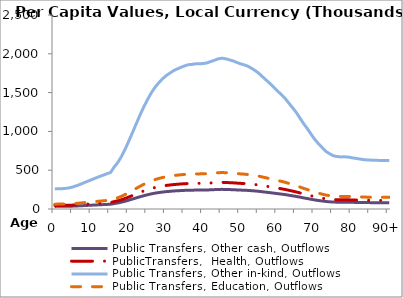
| Category | Public Transfers, Other cash, Outflows | PublicTransfers,  Health, Outflows | Public Transfers, Other in-kind, Outflows | Public Transfers, Education, Outflows |
|---|---|---|---|---|
| 0 | 33729.785 | 45748.895 | 259036.511 | 62617.094 |
|  | 33926.138 | 46015.216 | 260544.457 | 62981.611 |
| 2 | 34122.492 | 46281.537 | 262052.403 | 63346.128 |
| 3 | 34643.48 | 46988.171 | 266053.465 | 64313.308 |
| 4 | 35672.581 | 48383.978 | 273956.711 | 66223.765 |
| 5 | 37299.635 | 50590.809 | 286452.091 | 69244.283 |
| 6 | 39365.383 | 53392.654 | 302316.526 | 73079.205 |
| 7 | 41814.51 | 56714.492 | 321125.224 | 77625.846 |
| 8 | 44399.695 | 60220.87 | 340978.819 | 82425.071 |
| 9 | 46978.956 | 63719.212 | 360786.912 | 87213.296 |
| 10 | 49529.367 | 67178.425 | 380373.445 | 91947.964 |
| 11 | 52023.029 | 70560.666 | 399524.16 | 96577.281 |
| 12 | 54402.84 | 73788.487 | 417800.525 | 100995.24 |
| 13 | 56761.513 | 76987.639 | 435914.559 | 105373.96 |
| 14 | 59074.511 | 80124.839 | 453677.817 | 109667.886 |
| 15 | 61389.263 | 83264.419 | 471454.551 | 113965.069 |
| 16 | 70571.418 | 95718.499 | 541971.258 | 131011.127 |
| 17 | 78572.335 | 106570.425 | 603416.351 | 145864.296 |
| 18 | 88861.227 | 120525.611 | 682432.522 | 164964.936 |
| 19 | 101332.769 | 137441.203 | 778210.925 | 188117.522 |
| 20 | 115301.229 | 156387.116 | 885485.281 | 214049.034 |
| 21 | 129681.397 | 175891.445 | 995921.463 | 240744.857 |
| 22 | 144316.051 | 195740.942 | 1108312.036 | 267913.116 |
| 23 | 158678.481 | 215221.211 | 1218611.985 | 294576.007 |
| 24 | 172071.325 | 233386.397 | 1321465.76 | 319438.929 |
| 25 | 184260.198 | 249918.594 | 1415073.325 | 342066.757 |
| 26 | 195201.582 | 264758.778 | 1499100.482 | 362378.706 |
| 27 | 204449.953 | 277302.671 | 1570125.72 | 379547.691 |
| 28 | 212023.346 | 287574.73 | 1628287.525 | 393607.189 |
| 29 | 218528.347 | 296397.692 | 1678244.344 | 405683.289 |
| 30 | 223960.775 | 303765.885 | 1719964.066 | 415768.229 |
| 31 | 228142.671 | 309437.937 | 1752080.002 | 423531.639 |
| 32 | 232284.804 | 315056.059 | 1783890.578 | 431221.234 |
| 33 | 235172.879 | 318973.256 | 1806070.283 | 436582.751 |
| 34 | 237910.906 | 322686.939 | 1827097.664 | 441665.716 |
| 35 | 240282.455 | 325903.554 | 1845310.579 | 446068.338 |
| 36 | 242181.347 | 328479.088 | 1859893.608 | 449593.505 |
| 37 | 242687.852 | 329166.078 | 1863783.44 | 450533.797 |
| 38 | 243770.355 | 330634.316 | 1872096.802 | 452543.392 |
| 39 | 243808.806 | 330686.468 | 1872392.095 | 452614.773 |
| 40 | 244045.038 | 331006.878 | 1874206.301 | 453053.323 |
| 41 | 245284.072 | 332687.424 | 1883721.782 | 455353.507 |
| 42 | 247466.068 | 335646.942 | 1900478.976 | 459404.237 |
| 43 | 249660.242 | 338622.978 | 1917329.699 | 463477.575 |
| 44 | 252005.723 | 341804.236 | 1935342.418 | 467831.803 |
| 45 | 253058.198 | 343231.744 | 1943425.167 | 469785.652 |
| 46 | 252030.137 | 341837.35 | 1935529.914 | 467877.127 |
| 47 | 250257.12 | 339432.544 | 1921913.576 | 464585.639 |
| 48 | 248464.607 | 337001.295 | 1908147.51 | 461257.957 |
| 49 | 245914.47 | 333542.454 | 1888563.08 | 456523.798 |
| 50 | 243578.735 | 330374.415 | 1870625.206 | 452187.662 |
| 51 | 241805.95 | 327969.924 | 1857010.648 | 448896.605 |
| 52 | 239504.574 | 324848.487 | 1839336.647 | 444624.255 |
| 53 | 235937.73 | 320010.651 | 1811944.155 | 438002.647 |
| 54 | 232002.106 | 314672.625 | 1781719.521 | 430696.423 |
| 55 | 227253.157 | 308231.458 | 1745248.752 | 421880.316 |
| 56 | 221484.621 | 300407.391 | 1700947.811 | 411171.416 |
| 57 | 215742.792 | 292619.546 | 1656851.966 | 400512.093 |
| 58 | 210172.852 | 285064.84 | 1614076.186 | 390171.871 |
| 59 | 203973.648 | 276656.641 | 1566467.808 | 378663.462 |
| 60 | 197706.766 | 268156.648 | 1518339.685 | 367029.413 |
| 61 | 191962.016 | 260364.842 | 1474221.41 | 356364.669 |
| 62 | 185480.518 | 251573.758 | 1424445.09 | 344332.201 |
| 63 | 177658.786 | 240964.867 | 1364376.095 | 329811.677 |
| 64 | 169900.707 | 230442.312 | 1304795.946 | 315409.322 |
| 65 | 161925.235 | 219624.897 | 1243546.263 | 300603.39 |
| 66 | 152461.894 | 206789.435 | 1170870.115 | 283035.329 |
| 67 | 142921.148 | 193848.985 | 1097599.516 | 265323.571 |
| 68 | 134620.95 | 182591.135 | 1033856.024 | 249914.808 |
| 69 | 125359.854 | 170029.984 | 962733.069 | 232722.201 |
| 70 | 116651.631 | 158218.714 | 895856.042 | 216555.966 |
| 71 | 109345.048 | 148308.539 | 839743.272 | 202991.783 |
| 72 | 102902.458 | 139570.227 | 790265.752 | 191031.545 |
| 73 | 96508.933 | 130898.464 | 741165.041 | 179162.392 |
| 74 | 92665.635 | 125685.664 | 711649.449 | 172027.566 |
| 75 | 89272.775 | 121083.808 | 685593.112 | 165728.947 |
| 76 | 88081.601 | 119468.177 | 676445.188 | 163517.613 |
| 77 | 87384.749 | 118523.012 | 671093.533 | 162223.953 |
| 78 | 87576.406 | 118782.964 | 672565.416 | 162579.753 |
| 79 | 87142.68 | 118194.685 | 669234.502 | 161774.568 |
| 80 | 85962.718 | 116594.261 | 660172.681 | 159584.047 |
| 81 | 84975.525 | 115255.297 | 652591.284 | 157751.39 |
| 82 | 83912.455 | 113813.418 | 644427.167 | 155777.872 |
| 83 | 82963.932 | 112526.902 | 637142.738 | 154017.002 |
| 84 | 82362.621 | 111711.323 | 632524.82 | 152900.709 |
| 85 | 82054.518 | 111293.433 | 630158.665 | 152328.736 |
| 86 | 81709.346 | 110825.263 | 627507.827 | 151687.947 |
| 87 | 81585.829 | 110657.733 | 626559.249 | 151458.646 |
| 88 | 81533.745 | 110587.09 | 626159.254 | 151361.956 |
| 89 | 81556.176 | 110617.513 | 626331.515 | 151403.596 |
| 90+ | 81589.308 | 110662.451 | 626585.964 | 151465.104 |